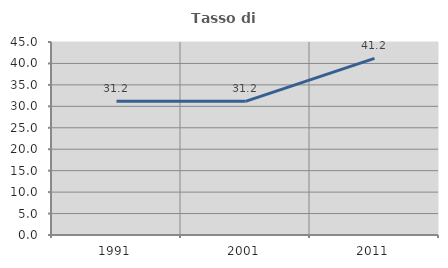
| Category | Tasso di occupazione   |
|---|---|
| 1991.0 | 31.214 |
| 2001.0 | 31.17 |
| 2011.0 | 41.183 |